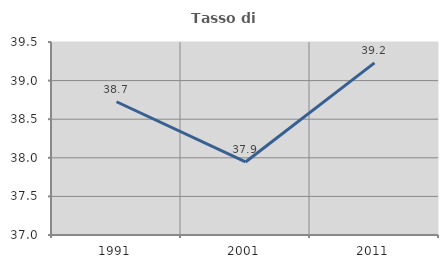
| Category | Tasso di occupazione   |
|---|---|
| 1991.0 | 38.726 |
| 2001.0 | 37.946 |
| 2011.0 | 39.23 |